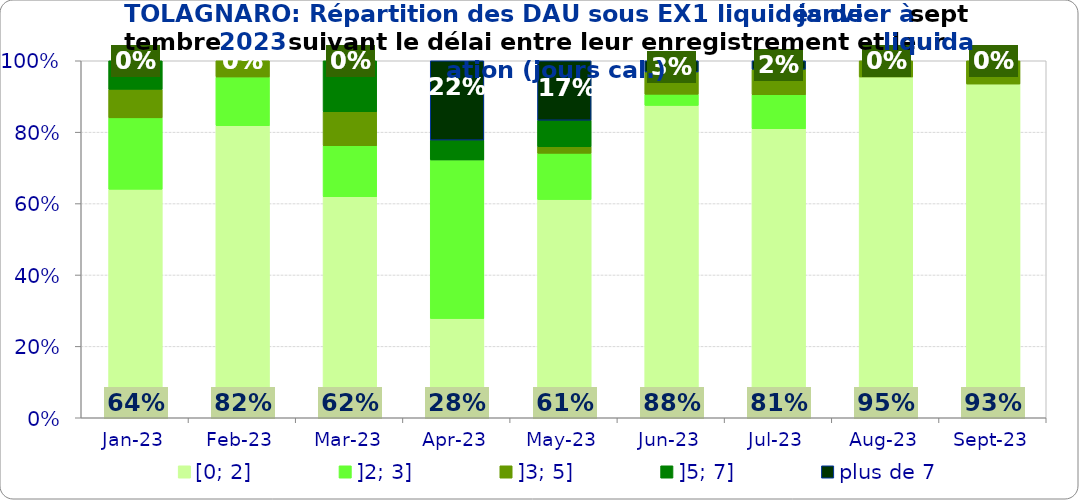
| Category | [0; 2] | ]2; 3] | ]3; 5] | ]5; 7] | plus de 7 |
|---|---|---|---|---|---|
| 2023-01-01 | 0.64 | 0.2 | 0.08 | 0.08 | 0 |
| 2023-02-01 | 0.818 | 0.136 | 0.045 | 0 | 0 |
| 2023-03-01 | 0.619 | 0.143 | 0.095 | 0.143 | 0 |
| 2023-04-01 | 0.278 | 0.444 | 0 | 0.056 | 0.222 |
| 2023-05-01 | 0.611 | 0.13 | 0.019 | 0.074 | 0.167 |
| 2023-06-01 | 0.875 | 0.031 | 0.062 | 0 | 0.031 |
| 2023-07-01 | 0.81 | 0.095 | 0.071 | 0 | 0.024 |
| 2023-08-01 | 0.955 | 0 | 0.045 | 0 | 0 |
| 2023-09-01 | 0.935 | 0 | 0.065 | 0 | 0 |